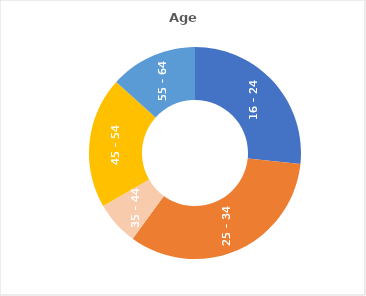
| Category | % |
|---|---|
| 16 - 24 | 23.529 |
| 25 - 34 | 29.412 |
| 35 - 44 | 5.882 |
| 45 - 54 | 17.647 |
| 55 - 64 | 11.765 |
| 65+ | 0 |